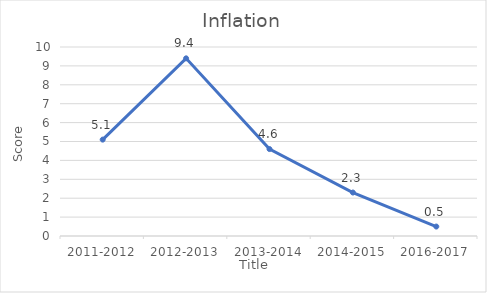
| Category | Series 0 |
|---|---|
| 2011-2012 | 5.1 |
| 2012-2013 | 9.4 |
| 2013-2014 | 4.6 |
| 2014-2015 | 2.3 |
| 2016-2017 | 0.5 |